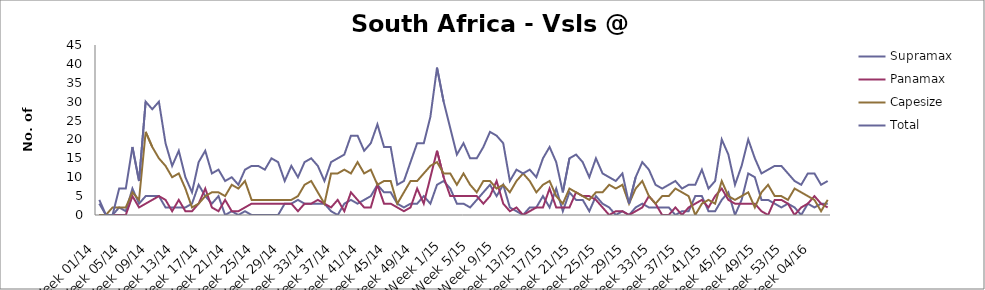
| Category | Supramax | Panamax | Capesize | Total |
|---|---|---|---|---|
| Week 01/14 | 3 | 0 | 0 | 4 |
| Week 02/14 | 0 | 0 | 0 | 0 |
| Week 03/14 | 0 | 0 | 2 | 0 |
| Week 04/14 | 2 | 0 | 2 | 7 |
| Week 05/14 | 1 | 0 | 2 | 7 |
| Week 06/14 | 7 | 5 | 6 | 18 |
| Week 07/14 | 3 | 2 | 4 | 9 |
| Week 08/14 | 5 | 3 | 22 | 30 |
| Week 09/14 | 5 | 4 | 18 | 28 |
| Week 10/14 | 5 | 5 | 15 | 30 |
| Week 11/14 | 2 | 4 | 13 | 19 |
| Week 12/14 | 2 | 1 | 10 | 13 |
| Week 13/14 | 2 | 4 | 11 | 17 |
| Week 14/14 | 2 | 1 | 7 | 10 |
| Week 15/14 | 3 | 1 | 2 | 6 |
| Week 16/14 | 8 | 3 | 3 | 14 |
| Week 17/14 | 5 | 7 | 5 | 17 |
| Week 18/14 | 3 | 2 | 6 | 11 |
| Week 19/14 | 5 | 1 | 6 | 12 |
| Week 20/14 | 0 | 4 | 5 | 9 |
| Week 21/14 | 1 | 1 | 8 | 10 |
| Week 22/14 | 0 | 1 | 7 | 8 |
| Week 23/14 | 1 | 2 | 9 | 12 |
| Week 24/14 | 0 | 3 | 4 | 13 |
| Week 25/14 | 0 | 3 | 4 | 13 |
| Week 26/14 | 0 | 3 | 4 | 12 |
| Week 27/14 | 0 | 3 | 4 | 15 |
| Week 28/14 | 0 | 3 | 4 | 14 |
| Week 29/14 | 3 | 3 | 4 | 9 |
| Week 30/14 | 3 | 3 | 4 | 13 |
| Week 31/14 | 4 | 1 | 5 | 10 |
| Week 32/14 | 3 | 3 | 8 | 14 |
| Week 33/14 | 3 | 3 | 9 | 15 |
| Week 34/14 | 3 | 4 | 6 | 13 |
| Week 35/14 | 3 | 3 | 3 | 9 |
| Week 36/14 | 1 | 2 | 11 | 14 |
| Week 37/14 | 0 | 4 | 11 | 15 |
| Week 38/14 | 3 | 1 | 12 | 16 |
| Week 39/14 | 4 | 6 | 11 | 21 |
| Week 40/14 | 3 | 4 | 14 | 21 |
| Week 41/14 | 4 | 2 | 11 | 17 |
| Week 42/14 | 5 | 2 | 12 | 19 |
| Week 43/14 | 8 | 8 | 8 | 24 |
| Week 44/14 | 6 | 3 | 9 | 18 |
| Week 45/14 | 6 | 3 | 9 | 18 |
| Week 46/14 | 3 | 2 | 3 | 8 |
| Week 47/14 | 2 | 1 | 6 | 9 |
| Week 48/14 | 3 | 2 | 9 | 14 |
| Week 49/14 | 3 | 7 | 9 | 19 |
| Week 50/14 | 5 | 3 | 11 | 19 |
| Week 51/14 | 3 | 10 | 13 | 26 |
| Week 52/14 | 8 | 17 | 14 | 39 |
| Week 1/15 | 9 | 10 | 11 | 30 |
| Week 2/15 | 7 | 5 | 11 | 23 |
| Week 3/15 | 3 | 5 | 8 | 16 |
| Week 4/15 | 3 | 5 | 11 | 19 |
| Week 5/15 | 2 | 5 | 8 | 15 |
| Week 6/15 | 4 | 5 | 6 | 15 |
| Week 7/15 | 6 | 3 | 9 | 18 |
| Week 8/15 | 8 | 5 | 9 | 22 |
| Week 9/15 | 5 | 9 | 7 | 21 |
| Week 10/15 | 8 | 3 | 8 | 19 |
| Week 11/15 | 2 | 1 | 6 | 9 |
| Week 12/15 | 1 | 2 | 9 | 12 |
| Week 13/15 | 0 | 0 | 11 | 11 |
| Week 14/15 | 2 | 1 | 9 | 12 |
| Week 15/15 | 2 | 2 | 6 | 10 |
| Week 16/15 | 5 | 2 | 8 | 15 |
| Week 17/15 | 2 | 7 | 9 | 18 |
| Week 18/15 | 7 | 2 | 5 | 14 |
| Week 19/15 | 1 | 2 | 3 | 6 |
| Week 20/15 | 6 | 2 | 7 | 15 |
| Week 21/15 | 4 | 6 | 6 | 16 |
| Week 22/15 | 4 | 5 | 5 | 14 |
| Week 23/15 | 1 | 5 | 4 | 10 |
| Week 24/15 | 5 | 4 | 6 | 15 |
| Week 25/15 | 3 | 2 | 6 | 11 |
| Week 26/15 | 2 | 0 | 8 | 10 |
| Week 27/15 | 0 | 1 | 7 | 9 |
| Week 28/15 | 1 | 1 | 8 | 11 |
| Week 29/15 | 0 | 0 | 3 | 3 |
| Week 30/15 | 2 | 1 | 7 | 10 |
| Week 31/15 | 3 | 2 | 9 | 14 |
| Week 32/15 | 2 | 5 | 5 | 12 |
| Week 33/15 | 2 | 3 | 3 | 8 |
| Week 34/15 | 2 | 0 | 5 | 7 |
| Week 35/15 | 2 | 0 | 5 | 8 |
| Week 36/15 | 0 | 2 | 7 | 9 |
| Week 37/15 | 1 | 0 | 6 | 7 |
| Week 38/15 | 1 | 2 | 5 | 8 |
| Week 39/15 | 5 | 3 | 0 | 8 |
| Week 40/15 | 5 | 4 | 3 | 12 |
| Week 41/15 | 1 | 2 | 4 | 7 |
| Week 42/15 | 1 | 5 | 3 | 9 |
| Week 43/15 | 4 | 7 | 9 | 20 |
| Week 44/15 | 6 | 4 | 5 | 16 |
| Week 45/15 | 0 | 3 | 4 | 8 |
| Week 46/15 | 4 | 3 | 5 | 13 |
| Week 47/15 | 11 | 3 | 6 | 20 |
| Week 48/15 | 10 | 3 | 2 | 15 |
| Week 49/15 | 4 | 1 | 6 | 11 |
| Week 50/15 | 4 | 0 | 8 | 12 |
| Week 51/15 | 3 | 4 | 5 | 13 |
| Week 52/15 | 2 | 4 | 5 | 13 |
| Week 53/15 | 3 | 3 | 4 | 11 |
| Week 01/16 | 2 | 0 | 7 | 9 |
| Week 02/16 | 0 | 2 | 6 | 8 |
| Week 03/16 | 3 | 3 | 5 | 11 |
| Week 04/16 | 2 | 5 | 4 | 11 |
| Week 05/16 | 3 | 3 | 1 | 8 |
| Week 06/16 | 3 | 2 | 4 | 9 |